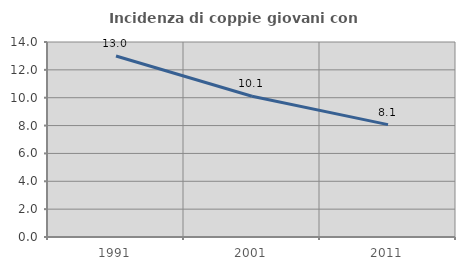
| Category | Incidenza di coppie giovani con figli |
|---|---|
| 1991.0 | 12.995 |
| 2001.0 | 10.103 |
| 2011.0 | 8.067 |